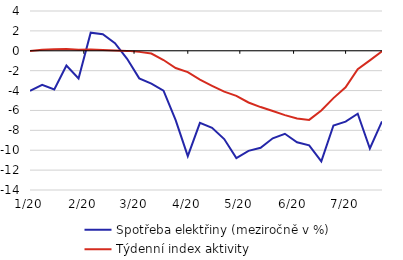
| Category | Spotřeba elektřiny (meziročně v %) | Týdenní index aktivity |
|---|---|---|
| 2020-01-06 | -4.026 | -0.03 |
| 2020-01-13 | -3.426 | 0.1 |
| 2020-01-20 | -3.896 | 0.15 |
| 2020-01-27 | -1.476 | 0.17 |
| 2020-02-03 | -2.776 | 0.11 |
| 2020-02-10 | 1.824 | 0.14 |
| 2020-02-17 | 1.667 | 0.08 |
| 2020-02-24 | 0.768 | 0.04 |
| 2020-03-02 | -0.807 | -0.01 |
| 2020-03-09 | -2.776 | -0.11 |
| 2020-03-16 | -3.298 | -0.28 |
| 2020-03-23 | -4.019 | -0.93 |
| 2020-03-30 | -6.98 | -1.73 |
| 2020-04-06 | -10.596 | -2.15 |
| 2020-04-13 | -7.243 | -2.9 |
| 2020-04-20 | -7.74 | -3.52 |
| 2020-04-27 | -8.876 | -4.11 |
| 2020-05-04 | -10.786 | -4.53 |
| 2020-05-11 | -10.065 | -5.2 |
| 2020-05-18 | -9.755 | -5.66 |
| 2020-05-25 | -8.804 | -6.06 |
| 2020-06-01 | -8.349 | -6.47 |
| 2020-06-08 | -9.194 | -6.81 |
| 2020-06-15 | -9.504 | -6.95 |
| 2020-06-22 | -11.116 | -6 |
| 2020-06-29 | -7.514 | -4.76 |
| 2020-07-06 | -7.122 | -3.68 |
| 2020-07-13 | -6.335 | -1.85 |
| 2020-07-20 | -9.824 | -0.97 |
| 2020-07-27 | -7.1 | -0.06 |